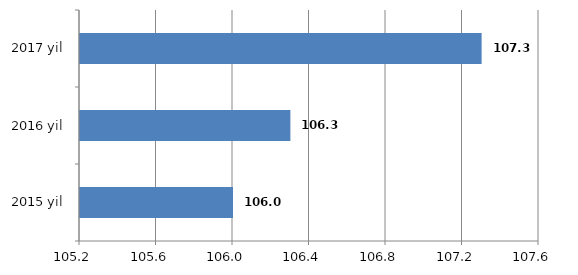
| Category | Series 0 |
|---|---|
| 2015 yil | 106 |
| 2016 yil | 106.3 |
| 2017 yil | 107.3 |